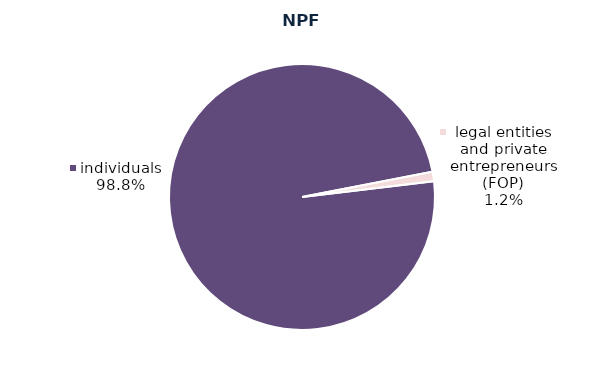
| Category | Series 0 |
|---|---|
| legal entities and private entrepreneurs (FOP) | 715 |
| individuals | 61025 |